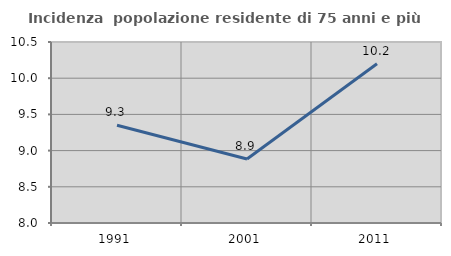
| Category | Incidenza  popolazione residente di 75 anni e più |
|---|---|
| 1991.0 | 9.35 |
| 2001.0 | 8.884 |
| 2011.0 | 10.199 |